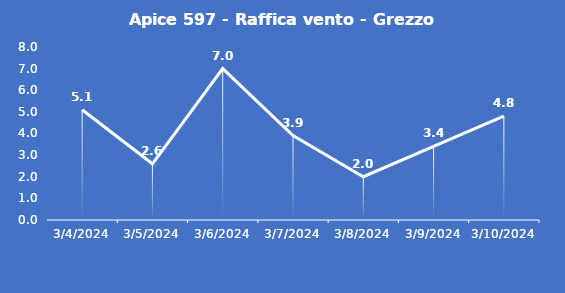
| Category | Apice 597 - Raffica vento - Grezzo (m/s) |
|---|---|
| 3/4/24 | 5.1 |
| 3/5/24 | 2.6 |
| 3/6/24 | 7 |
| 3/7/24 | 3.9 |
| 3/8/24 | 2 |
| 3/9/24 | 3.4 |
| 3/10/24 | 4.8 |